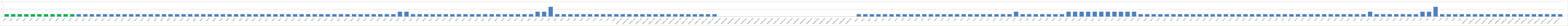
| Category | Series 0 |
|---|---|
| AW01 | 1 |
| AW02 | 1 |
| AW03 | 1 |
| AW04 | 1 |
| AW05 | 1 |
| AW06 | 1 |
| AW07 | 1 |
| AW08 | 1 |
| AW09 | 1 |
| AW10 | 1 |
| AW11 | 1 |
| AW12 | 1 |
| AW13 | 1 |
| AW14 | 1 |
| AW15 | 1 |
| AW16 | 1 |
| AW17 | 1 |
| AW18 | 1 |
| AW19 | 1 |
| AW20 | 1 |
| AW21 | 1 |
| AW22 | 1 |
| AW23 | 1 |
| AW24 | 1 |
| AW25 | 1 |
| AW26 | 1 |
| AW27 | 1 |
| AW28 | 1 |
| AW29 | 1 |
| BW01 | 1 |
| BW02 | 1 |
| BW03 | 1 |
| BWO4 | 1 |
| BW05 | 1 |
| BW06 | 1 |
| BW07 | 1 |
| BW08 | 1 |
| BW09 | 1 |
| BW10 | 1 |
| BW11 | 1 |
| BW12 | 1 |
| BW13 | 1 |
| BW14 | 1 |
| BW15 | 1 |
| BW16 | 1 |
| BW17 | 1 |
| BW18 | 1 |
| BW19 | 1 |
| BW20 | 1 |
| BW21 | 1 |
| BW22 | 1 |
| BW23 | 1 |
| BW24 | 1 |
| BW25 | 1 |
| BW26 | 1 |
| BW27 | 1 |
| BW28 | 1 |
| BW29 | 1 |
| BW30 | 1 |
| BW31 | 1 |
| BW32 | 2 |
| BW33 | 2 |
| BW34 | 1 |
| BW35 | 1 |
| BW36 | 1 |
| BW37 | 1 |
| BW38 | 1 |
| BW39 | 1 |
| BW40 | 1 |
| BW41 | 1 |
| BW42 | 1 |
| BW43 | 1 |
| BW44 | 1 |
| BW45 | 1 |
| BW46 | 1 |
| BW47 | 1 |
| BW48 | 1 |
| BW49 | 1 |
| BW50 | 1 |
| BW51 | 1 |
| BW52 | 1 |
| CW01 | 2 |
| CW02 | 2 |
| CW03 | 4 |
| CW04 | 1 |
| CW05 | 1 |
| CW06 | 1 |
| CW07 | 1 |
| CW08 | 1 |
| CW09 | 1 |
| CW10 | 1 |
| CW11 | 1 |
| CW12 | 1 |
| CW13 | 1 |
| AUMED. W01 | 1 |
| AUMED. W02 | 1 |
| AUMED. W03 | 1 |
| AUMED. W04 | 1 |
| AUMED. W05 | 1 |
| AUMED. W06 | 1 |
| AUMED. W07 | 1 |
| AUMED. W08 | 1 |
| AUMED.W09 | 1 |
| AUMED. W10 | 1 |
| AUMED. W11 | 1 |
| AUMED. W12 | 1 |
| AUMED. W13 | 1 |
| AUMED. W14 | 1 |
| AUMED. W15 | 1 |
| BUMED.W01 | 0 |
| BUMED.W02 | 0 |
| BUMED.W03 | 0 |
| BUMED.W04 | 0 |
| BUMED.W05 | 0 |
| BUMED.W06 | 0 |
| BUMED.W07 | 0 |
| BUMED.W08 | 0 |
| BUMED.W09 | 0 |
| BUMED.W10 | 0 |
| BUMED.W11 | 0 |
| BUMED.W12 | 0 |
| BUMED.W13 | 0 |
| BUMED.W14 | 0 |
| BUMED.W15 | 0 |
| BUMED.W16 | 0 |
| BUMED.W17 | 0 |
| BUMED.W18 | 0 |
| BUMED.W19 | 0 |
| BUMED.W20 | 0 |
| BUMED.W21 | 0 |
| AW22* | 1 |
| AW23* | 1 |
| AW24* | 1 |
| AW25* | 1 |
| AU01 | 1 |
| AU02 | 1 |
| AU03 | 1 |
| AU04 | 1 |
| AU05 | 1 |
| AU06 | 1 |
| AU07 | 1 |
| AU08 | 1 |
| AU09 | 1 |
| AU10 | 1 |
| AU11 | 1 |
| AU12 | 1 |
| AU13 | 1 |
| AU14 | 1 |
| AU15 | 1 |
| AU16 | 1 |
| AU17 | 1 |
| AU18 | 1 |
| AU19 | 1 |
| AU20 | 1 |
| AU21 | 2 |
| BU01 | 1 |
| BU02 | 1 |
| BU03 | 1 |
| BU04 | 1 |
| BU05 | 1 |
| BU06 | 1 |
| BU07 | 1 |
| BU08 | 2 |
| BU09 | 2 |
| BU10 | 2 |
| BU11 | 2 |
| BU12 | 2 |
| BU13 | 2 |
| BU14 | 2 |
| BU15 | 2 |
| BU16 | 2 |
| BU17 | 2 |
| BU18 | 2 |
| BU19 | 1 |
| BU20 | 1 |
| BU21 | 1 |
| BU22 | 1 |
| BU23 | 1 |
| BU24 | 1 |
| BU25 | 1 |
| BU26 | 1 |
| BU27 | 1 |
| BU28 | 1 |
| BU29 | 1 |
| BU30 | 1 |
| BU31 | 1 |
| BU32 | 1 |
| BU33 | 1 |
| BU34 | 1 |
| BU35 | 1 |
| BU36 | 1 |
| BU37 | 1 |
| BU38 | 1 |
| BU39 | 1 |
| BU40 | 1 |
| BU41 | 1 |
| BU42 | 1 |
| BU43 | 1 |
| BU44 | 1 |
| BU45 | 1 |
| BU46 | 1 |
| BU47 | 1 |
| BU48 | 1 |
| BU49 | 1 |
| BU50 | 1 |
| BU51 | 1 |
| BU52 | 1 |
| BU53 | 1 |
| BU54 | 2 |
| BU55 | 1 |
| BU56 | 1 |
| BU57 | 1 |
| BU58 | 1 |
| BU59 | 1 |
| BU60 | 1 |
| BU61 | 1 |
| CU01 | 2 |
| CU02 | 2 |
| CU03 | 4 |
| CU04 | 1 |
| CU05 | 1 |
| CU06 | 1 |
| CU07 | 1 |
| AUMED.U01 | 1 |
| AUMED.U02 | 1 |
| AUMED.U03 | 1 |
| AUMED.U04 | 1 |
| AUMED.U05 | 1 |
| AUMED.U06 | 1 |
| AUMED.U07 | 1 |
| AUMED.U08 | 1 |
| AUMED.U09 | 1 |
| AUMED.U10 | 1 |
| AUMED.U11 | 1 |
| AUMED.U12 | 1 |
| AUMED.U13 | 1 |
| AUMED.U14 | 1 |
| AUMED.U15 | 1 |